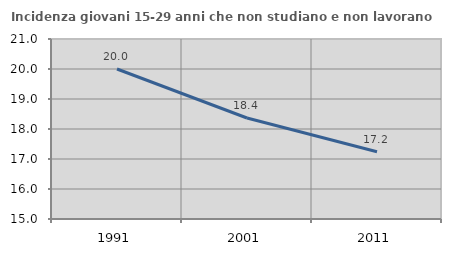
| Category | Incidenza giovani 15-29 anni che non studiano e non lavorano  |
|---|---|
| 1991.0 | 20 |
| 2001.0 | 18.367 |
| 2011.0 | 17.241 |